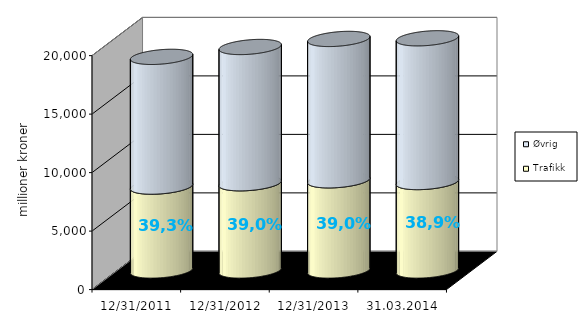
| Category | Trafikk | Øvrig |
|---|---|---|
| 31.12.2011 | 7171.76 | 11089.078 |
| 31.12.2012 | 7457.552 | 11647.433 |
| 31.12.2013 | 7709.892 | 12083.527 |
| 31.03.2014 | 7561.795 | 12286.699 |